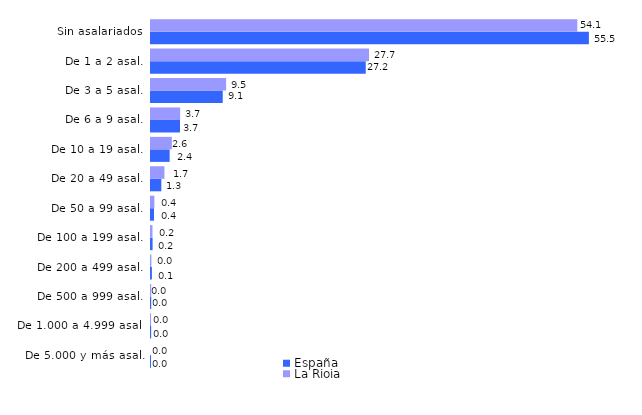
| Category | España | La Rioja |
|---|---|---|
| De 5.000 y más asal. | 0.004 | 0 |
| De 1.000 a 4.999 asal. | 0.022 | 0.009 |
| De 500 a 999 asal. | 0.03 | 0.022 |
| De 200 a 499 asal. | 0.114 | 0.047 |
| De 100 a 199 asal. | 0.203 | 0.19 |
| De 50 a 99 asal. | 0.382 | 0.427 |
| De 20 a 49 asal. | 1.312 | 1.705 |
| De 10 a 19 asal. | 2.365 | 2.642 |
| De 6 a 9 asal. | 3.677 | 3.699 |
| De 3 a 5 asal. | 9.102 | 9.526 |
| De 1 a 2 asal. | 27.242 | 27.656 |
| Sin asalariados | 55.547 | 54.077 |